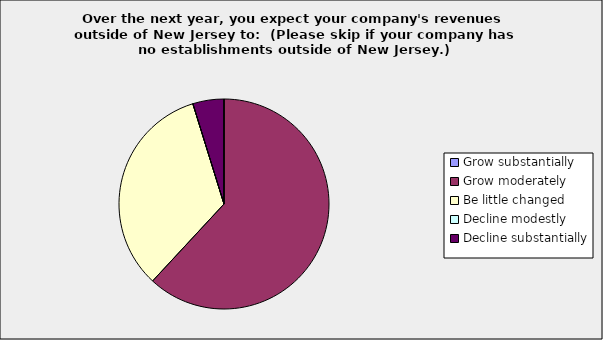
| Category | Series 0 |
|---|---|
| Grow substantially | 0 |
| Grow moderately | 0.619 |
| Be little changed | 0.333 |
| Decline modestly | 0 |
| Decline substantially | 0.048 |